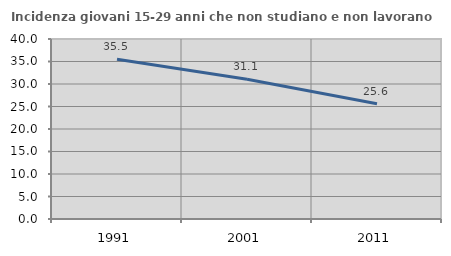
| Category | Incidenza giovani 15-29 anni che non studiano e non lavorano  |
|---|---|
| 1991.0 | 35.484 |
| 2001.0 | 31.057 |
| 2011.0 | 25.6 |